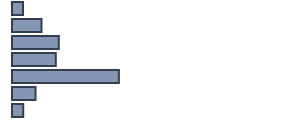
| Category | Series 0 |
|---|---|
| 0 | 4 |
| 1 | 10.8 |
| 2 | 17.2 |
| 3 | 16.1 |
| 4 | 39.3 |
| 5 | 8.6 |
| 6 | 4.1 |